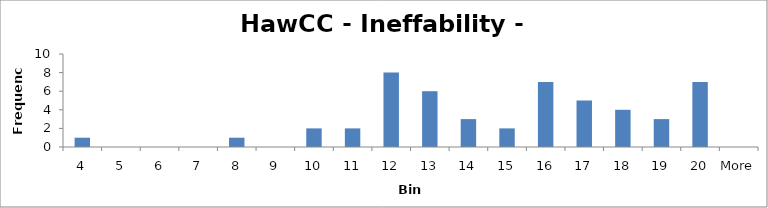
| Category | Frequency |
|---|---|
| 4 | 1 |
| 5 | 0 |
| 6 | 0 |
| 7 | 0 |
| 8 | 1 |
| 9 | 0 |
| 10 | 2 |
| 11 | 2 |
| 12 | 8 |
| 13 | 6 |
| 14 | 3 |
| 15 | 2 |
| 16 | 7 |
| 17 | 5 |
| 18 | 4 |
| 19 | 3 |
| 20 | 7 |
| More | 0 |